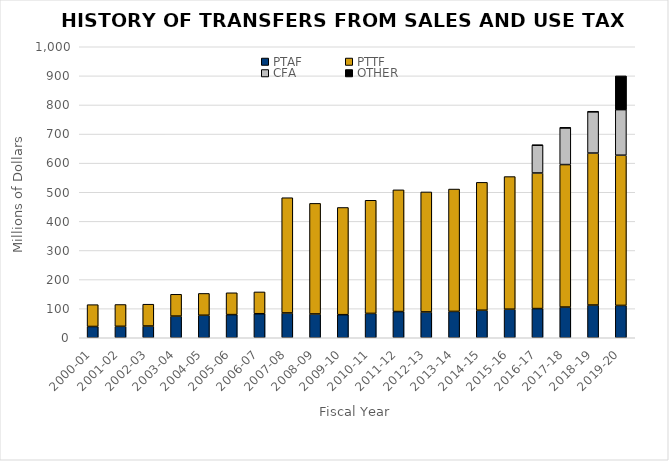
| Category | PTAF | PTTF | CFA | OTHER |
|---|---|---|---|---|
| 2000-01 | 38.749 | 75 | 0 | 0 |
| 2001-02 | 39.292 | 75 | 0 | 0 |
| 2002-03 | 40.291 | 75 | 0 | 0 |
| 2003-04 | 74.397 | 75 | 0 | 0 |
| 2004-05 | 77.336 | 75 | 0 | 0 |
| 2005-06 | 79.561 | 75 | 0 | 0 |
| 2006-07 | 82.538 | 75 | 0 | 0 |
| 2007-08 | 85.231 | 396 | 0 | 0 |
| 2008-09 | 81.792 | 380.028 | 0 | 0 |
| 2009-10 | 79.294 | 368.418 | 0 | 0 |
| 2010-11 | 83.677 | 388.8 | 0 | 0 |
| 2011-12 | 90.028 | 418.293 | 0 | 0 |
| 2012-13 | 88.753 | 412.368 | 0 | 0 |
| 2013-14 | 90.505 | 420.508 | 0 | 0 |
| 2014-15 | 94.589 | 439.486 | 0 | 0 |
| 2015-16 | 98.1 | 455.796 | 0 | 0 |
| 2016-17 | 100.284 | 465.944 | 95.347 | 0.7 |
| 2017-18 | 105.413 | 489.776 | 126.231 | 0.344 |
| 2018-19 | 112.408 | 522.276 | 142.011 | 0.461 |
| 2019-20 | 111.102 | 516.209 | 156.583 | 116.036 |